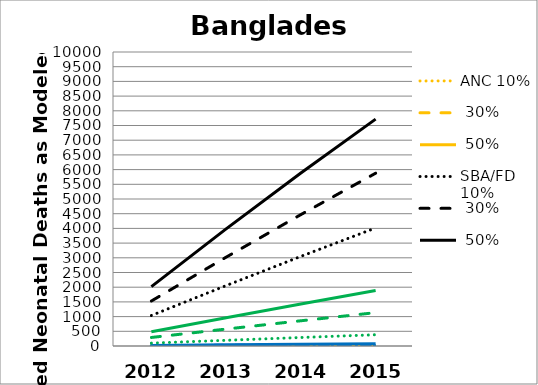
| Category | ANC 10% | ANC 30% | ANC 50% | SBA/FD 10% | SBA/FD 30% | SBA/FD 50% | BF 10% | BF 30% | BF 50% | PNC 10% | PNC 30% | PNC 50% |
|---|---|---|---|---|---|---|---|---|---|---|---|---|
| 2012.0 | 0 | 0 | 0 | 1038 | 1530 | 2021 | 4 | 12 | 20 | 98 | 290 | 482 |
| 2013.0 | 0 | 1 | 1 | 2055 | 3021 | 3984 | 8 | 24 | 41 | 194 | 576 | 958 |
| 2014.0 | 0 | 1 | 2 | 3048 | 4470 | 5882 | 12 | 36 | 61 | 289 | 858 | 1427 |
| 2015.0 | 0 | 1 | 2 | 4016 | 5877 | 7717 | 16 | 48 | 80 | 383 | 1135 | 1888 |